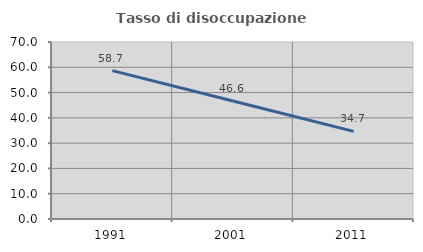
| Category | Tasso di disoccupazione giovanile  |
|---|---|
| 1991.0 | 58.696 |
| 2001.0 | 46.641 |
| 2011.0 | 34.657 |